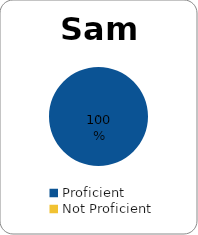
| Category | Series 0 |
|---|---|
| Proficient | 1 |
| Not Proficient | 0 |